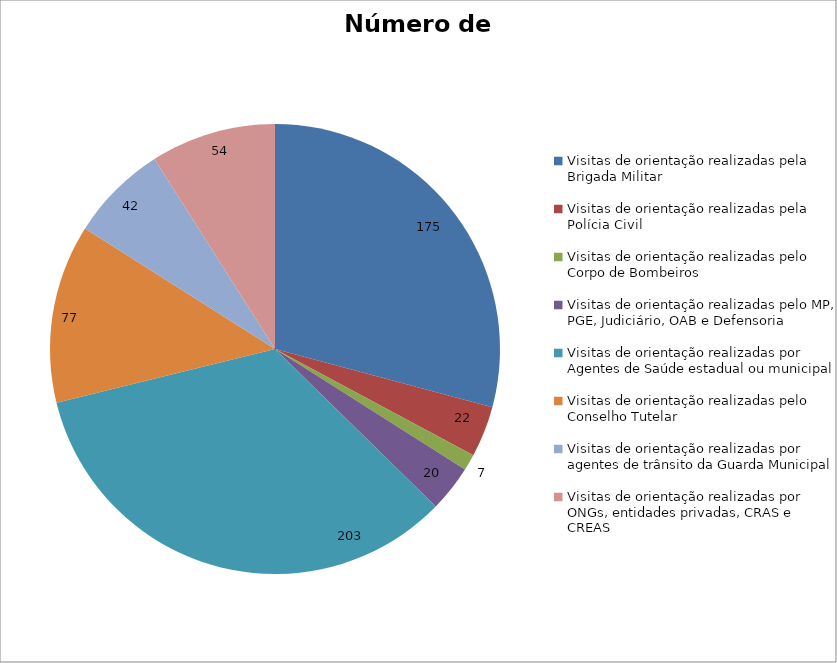
| Category | Número de Ações |
|---|---|
| Visitas de orientação realizadas pela Brigada Militar | 175 |
| Visitas de orientação realizadas pela Polícia Civil | 22 |
| Visitas de orientação realizadas pelo Corpo de Bombeiros | 7 |
| Visitas de orientação realizadas pelo MP, PGE, Judiciário, OAB e Defensoria | 20 |
| Visitas de orientação realizadas por Agentes de Saúde estadual ou municipal | 203 |
| Visitas de orientação realizadas pelo Conselho Tutelar | 77 |
| Visitas de orientação realizadas por agentes de trânsito da Guarda Municipal | 42 |
| Visitas de orientação realizadas por ONGs, entidades privadas, CRAS e CREAS | 54 |